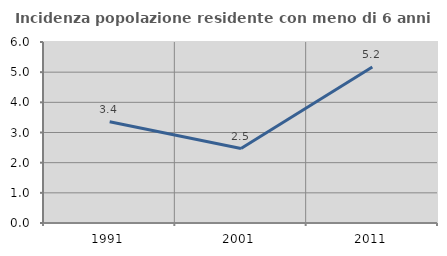
| Category | Incidenza popolazione residente con meno di 6 anni |
|---|---|
| 1991.0 | 3.359 |
| 2001.0 | 2.469 |
| 2011.0 | 5.172 |